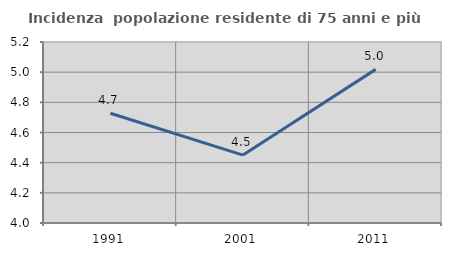
| Category | Incidenza  popolazione residente di 75 anni e più |
|---|---|
| 1991.0 | 4.728 |
| 2001.0 | 4.45 |
| 2011.0 | 5.018 |